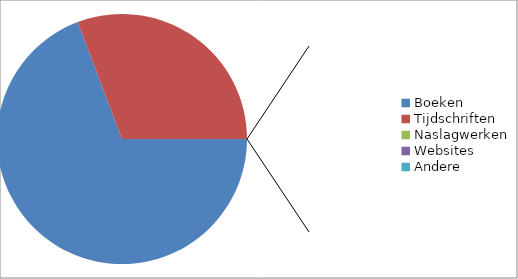
| Category | Series 0 |
|---|---|
| Boeken | 0.692 |
| Tijdschriften | 0.308 |
| Naslagwerken | 0 |
| Websites | 0 |
| Andere | 0 |